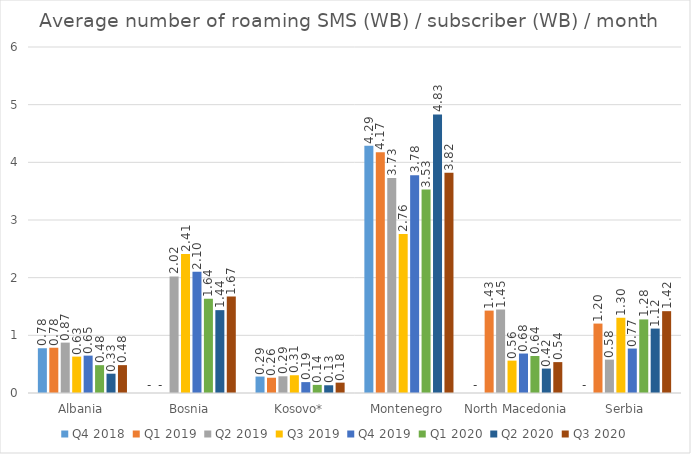
| Category | Q4 2018 | Q1 2019 | Q2 2019 | Q3 2019 | Q4 2019 | Q1 2020 | Q2 2020 | Q3 2020 |
|---|---|---|---|---|---|---|---|---|
| Albania | 0.776 | 0.785 | 0.874 | 0.631 | 0.648 | 0.483 | 0.335 | 0.483 |
| Bosnia | 0 | 0 | 2.022 | 2.408 | 2.103 | 1.636 | 1.437 | 1.673 |
| Kosovo* | 0.285 | 0.264 | 0.29 | 0.308 | 0.189 | 0.141 | 0.134 | 0.18 |
| Montenegro | 4.287 | 4.175 | 3.727 | 2.756 | 3.778 | 3.529 | 4.83 | 3.818 |
| North Macedonia | 0 | 1.429 | 1.448 | 0.561 | 0.684 | 0.641 | 0.424 | 0.536 |
| Serbia | 0 | 1.204 | 0.579 | 1.305 | 0.771 | 1.276 | 1.117 | 1.419 |